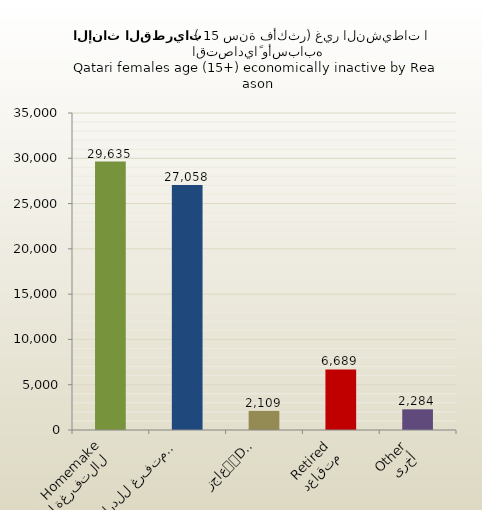
| Category | الاناث القطريات |
|---|---|
| التفرغة لأعمال المنزل
Homemaker | 29635 |
| متفرغ للدراسة
Student | 27058 |
| عاجز
Disabled | 2109 |
| متقاعد
Retired | 6689 |
| أخرى
Other | 2284 |